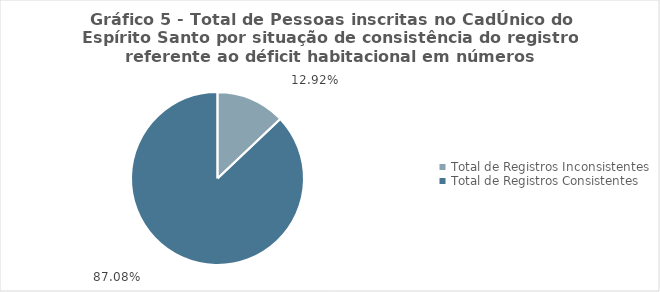
| Category | Series 0 |
|---|---|
| Total de Registros Inconsistentes | 0.129 |
| Total de Registros Consistentes | 0.871 |